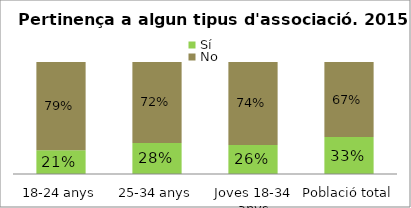
| Category | Sí | No |
|---|---|---|
| 18-24 anys | 0.213 | 0.787 |
| 25-34 anys | 0.277 | 0.723 |
| Joves 18-34 anys | 0.259 | 0.741 |
| Població total | 0.329 | 0.669 |